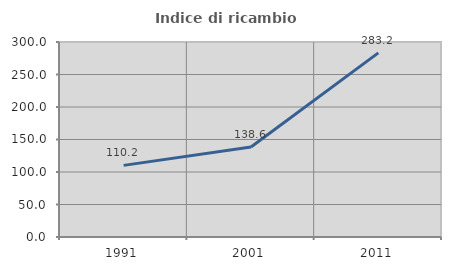
| Category | Indice di ricambio occupazionale  |
|---|---|
| 1991.0 | 110.191 |
| 2001.0 | 138.571 |
| 2011.0 | 283.246 |